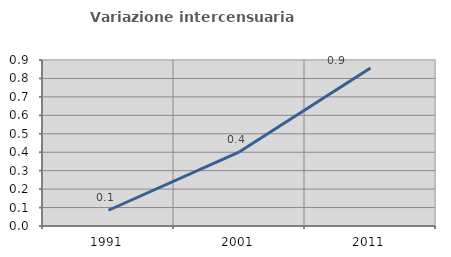
| Category | Variazione intercensuaria annua |
|---|---|
| 1991.0 | 0.085 |
| 2001.0 | 0.402 |
| 2011.0 | 0.857 |